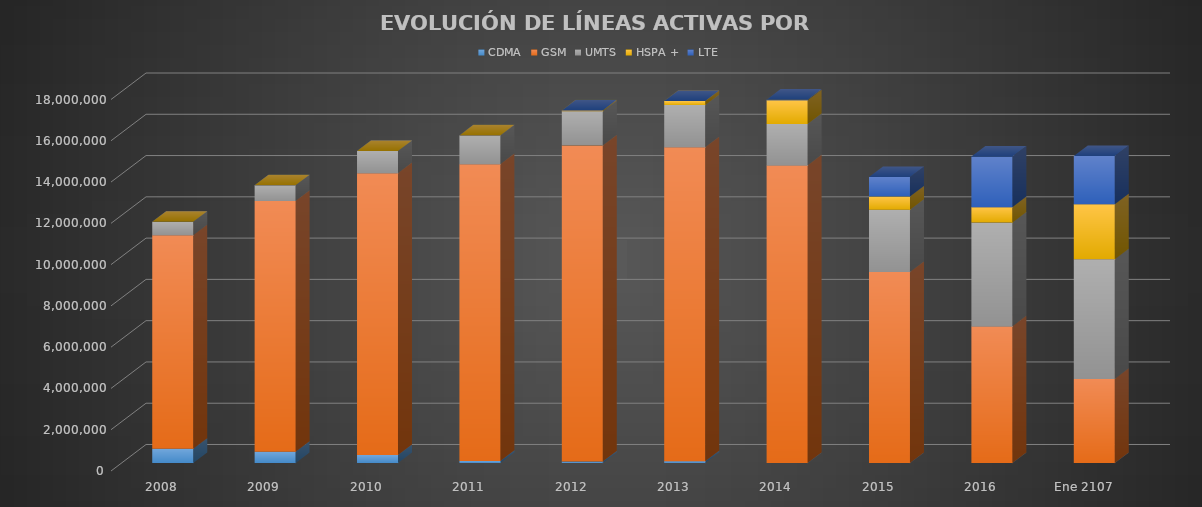
| Category | CDMA | GSM | UMTS | HSPA + | LTE |
|---|---|---|---|---|---|
| 2008 | 688357 | 10346902 | 656989 | 0 | 0 |
| 2009 | 544313 | 12151710 | 758577 | 0 | 0 |
| 2010 | 389834 | 13657394 | 1071603 | 0 | 0 |
| 2011 | 102115 | 14379423 | 1393020 | 0 | 0 |
| 2012 | 75179 | 15310006 | 1658596 | 43082 | 0 |
| 2013 | 83748 | 15215287 | 2043321 | 199398 | 0 |
| 2014 | 3009 | 14418144 | 2006405 | 1148823 | 28176 |
| 2015 | 0 | 9252920 | 3019889 | 636488 | 949723 |
| 2016 | 0 | 6621574 | 5027714 | 748032 | 2450814 |
| Ene 2107 | 0 | 4077503.931 | 5791273 | 2666950 | 2337499 |